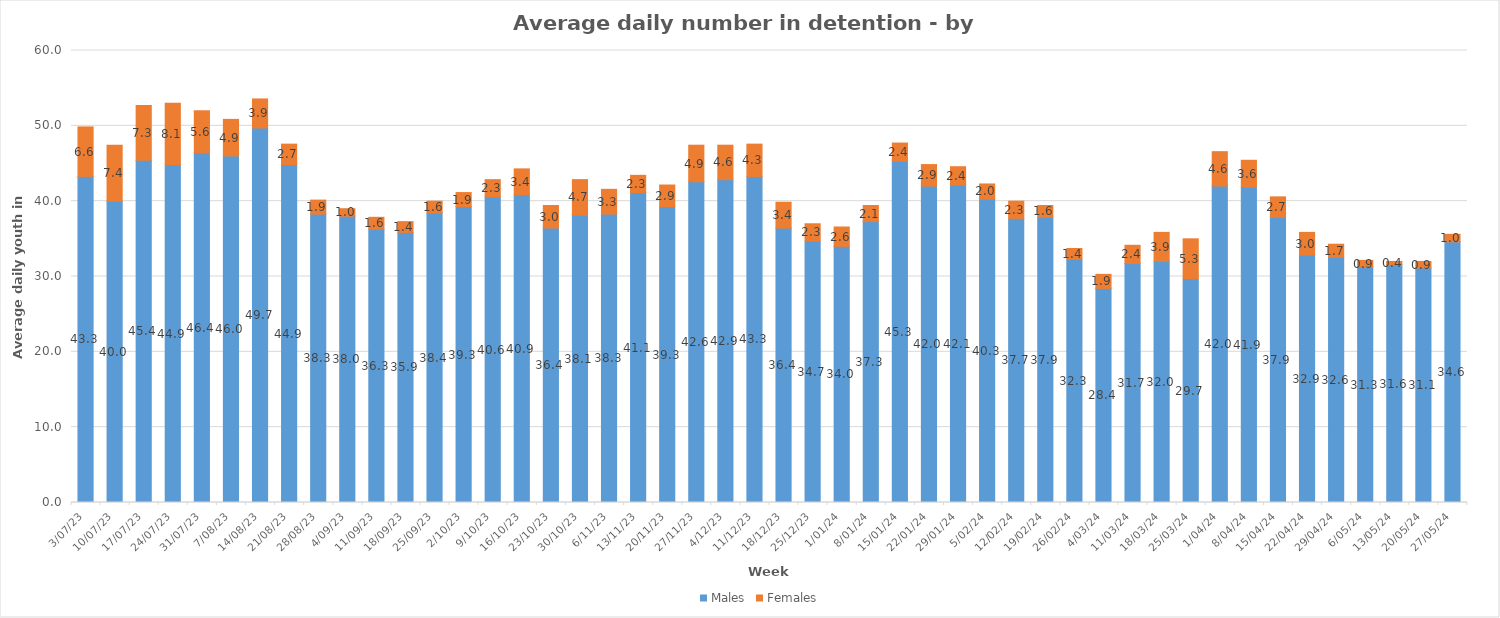
| Category | Males | Females |
|---|---|---|
| 3/07/23 | 43.286 | 6.571 |
| 10/07/23 | 40 | 7.429 |
| 17/07/23 | 45.429 | 7.286 |
| 24/07/23 | 44.857 | 8.143 |
| 31/07/23 | 46.429 | 5.571 |
| 7/08/23 | 46 | 4.857 |
| 14/08/23 | 49.714 | 3.857 |
| 21/08/23 | 44.857 | 2.714 |
| 28/08/23 | 38.286 | 1.857 |
| 4/09/23 | 38 | 1 |
| 11/09/23 | 36.286 | 1.571 |
| 18/09/23 | 35.857 | 1.429 |
| 25/09/23 | 38.429 | 1.571 |
| 2/10/23 | 39.286 | 1.857 |
| 9/10/23 | 40.571 | 2.286 |
| 16/10/23 | 40.857 | 3.429 |
| 23/10/23 | 36.429 | 3 |
| 30/10/23 | 38.143 | 4.714 |
| 6/11/23 | 38.286 | 3.286 |
| 13/11/23 | 41.143 | 2.286 |
| 20/11/23 | 39.286 | 2.857 |
| 27/11/23 | 42.571 | 4.857 |
| 4/12/23 | 42.857 | 4.571 |
| 11/12/23 | 43.286 | 4.286 |
| 18/12/23 | 36.429 | 3.429 |
| 25/12/23 | 34.714 | 2.286 |
| 1/01/24 | 34 | 2.571 |
| 8/01/24 | 37.286 | 2.143 |
| 15/01/24 | 45.286 | 2.429 |
| 22/01/24 | 42 | 2.857 |
| 29/01/24 | 42.143 | 2.429 |
| 5/02/24 | 40.286 | 2 |
| 12/02/24 | 37.714 | 2.286 |
| 19/02/24 | 37.857 | 1.571 |
| 26/02/24 | 32.286 | 1.429 |
| 4/03/24 | 28.429 | 1.857 |
| 11/03/24 | 31.714 | 2.429 |
| 18/03/24 | 32 | 3.857 |
| 25/03/24 | 29.714 | 5.286 |
| 1/04/24 | 42 | 4.571 |
| 8/04/24 | 41.857 | 3.571 |
| 15/04/24 | 37.857 | 2.714 |
| 22/04/24 | 32.857 | 3 |
| 29/04/24 | 32.571 | 1.714 |
| 6/05/24 | 31.286 | 0.857 |
| 13/05/24 | 31.571 | 0.429 |
| 20/05/24 | 31.143 | 0.857 |
| 27/05/24 | 34.6 | 1 |